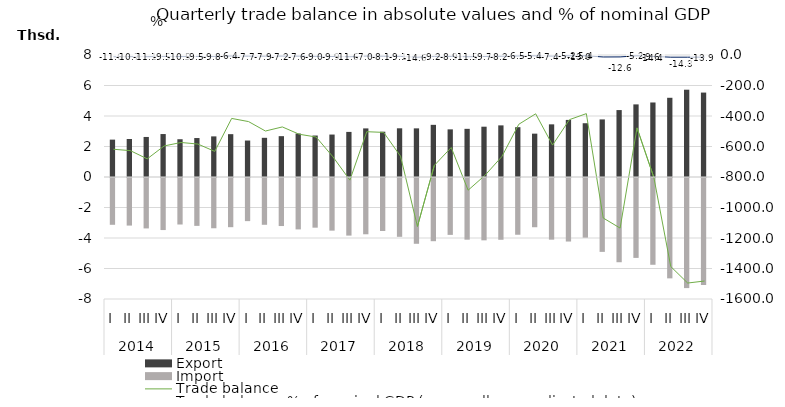
| Category | Export | Import |
|---|---|---|
| 0 | 2450.7 | -3068.8 |
| 1 | 2493.4 | -3120.5 |
| 2 | 2625.5 | -3306.5 |
| 3 | 2816.7 | -3413.2 |
| 4 | 2476.5 | -3050.1 |
| 5 | 2555.2 | -3139.2 |
| 6 | 2663.4 | -3295.5 |
| 7 | 2809.5 | -3225.4 |
| 8 | 2391.5 | -2828.1 |
| 9 | 2569.5 | -3068 |
| 10 | 2678.2 | -3149.9 |
| 11 | 2850.8 | -3370.5 |
| 12 | 2719.6 | -3257.4 |
| 13 | 2783.8 | -3452 |
| 14 | 2956.9 | -3777.4 |
| 15 | 3187 | -3690 |
| 16 | 2969.9 | -3477.4 |
| 17 | 3193.3 | -3857.4 |
| 18 | 3189.7 | -4313.9 |
| 19 | 3420.5 | -4144.2 |
| 20 | 3123.6 | -3730.2 |
| 21 | 3158.2 | -4044.8 |
| 22 | 3298.5 | -4087.5 |
| 23 | 3385.3 | -4051.1 |
| 24 | 3266.4 | -3720.9 |
| 25 | 2842.7 | -3228.3 |
| 26 | 3452.8 | -4043.7 |
| 27 | 3742.7 | -4166.6 |
| 28 | 3526.2 | -3910.7 |
| 29 | 3776 | -4844.9 |
| 30 | 4388.7 | -5523.8 |
| 31 | 4761.5 | -5239.5 |
| 32 | 4886.7 | -5690.3 |
| 33 | 5194.3 | -6581.5 |
| 34 | 5724 | -7219.3 |
| 35 | 5536.4 | -7018.4 |